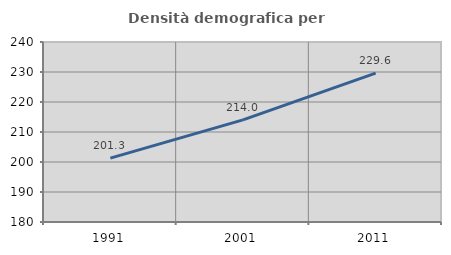
| Category | Densità demografica |
|---|---|
| 1991.0 | 201.288 |
| 2001.0 | 214.029 |
| 2011.0 | 229.614 |